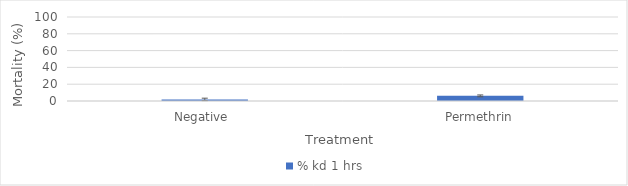
| Category | % kd 1 hrs |
|---|---|
| Negative  | 1.887 |
| Permethrin | 6.122 |